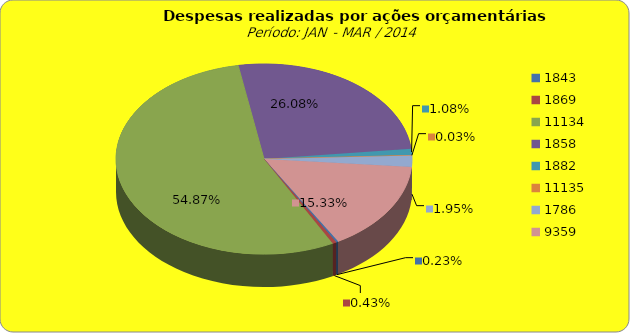
| Category | Series 1 |
|---|---|
| 1843.0 | 100000 |
| 1869.0 | 184807.3 |
| 11134.0 | 23473397.46 |
| 1858.0 | 11155431.43 |
| 1882.0 | 460659.2 |
| 11135.0 | 14867.92 |
| 1786.0 | 833796.26 |
| 9359.0 | 6556727.07 |